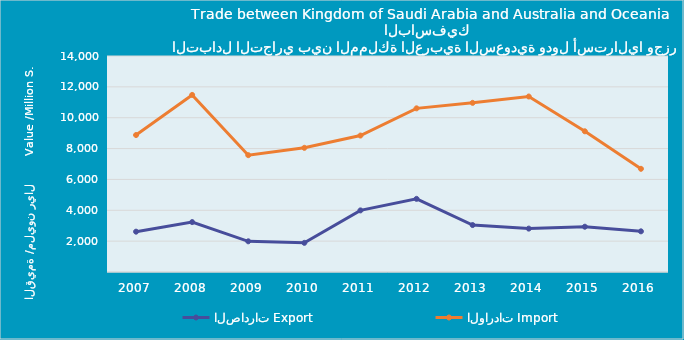
| Category | الصادرات | الواردات |
|---|---|---|
| 2007.0 | 2613840431 | 8877063519 |
| 2008.0 | 3235022853 | 11477647850 |
| 2009.0 | 1989430856 | 7572924237 |
| 2010.0 | 1889668285 | 8048279335 |
| 2011.0 | 3992682331 | 8843697237 |
| 2012.0 | 4741151889 | 10607402622 |
| 2013.0 | 3042564981 | 10963237325 |
| 2014.0 | 2811960625 | 11374150151 |
| 2015.0 | 2934836125 | 9119675680 |
| 2016.0 | 2636107734 | 6688587788 |